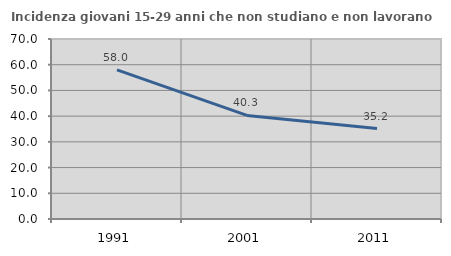
| Category | Incidenza giovani 15-29 anni che non studiano e non lavorano  |
|---|---|
| 1991.0 | 57.99 |
| 2001.0 | 40.293 |
| 2011.0 | 35.178 |